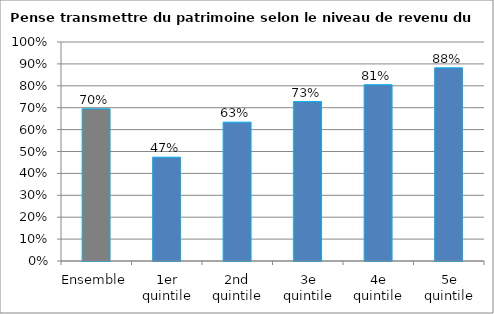
| Category | Pense transmettre du patrimoine selon le niveau de revenu du foyer |
|---|---|
| Ensemble | 0.695 |
| 1er quintile | 0.474 |
| 2nd quintile | 0.634 |
| 3e quintile | 0.728 |
| 4e quintile | 0.805 |
| 5e quintile | 0.882 |